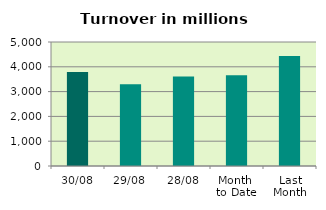
| Category | Series 0 |
|---|---|
| 30/08 | 3786.14 |
| 29/08 | 3296.259 |
| 28/08 | 3606.624 |
| Month 
to Date | 3664.297 |
| Last
Month | 4433.065 |